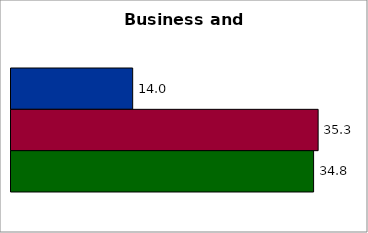
| Category | 50 states and D.C. | SREB states | State |
|---|---|---|---|
| 0 | 13.986 | 35.303 | 34.783 |